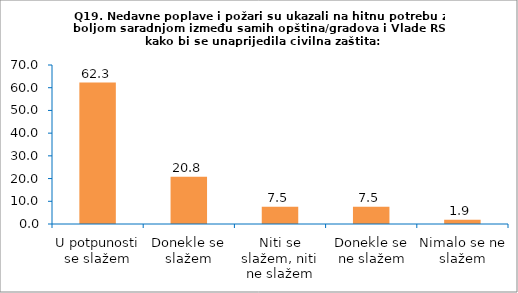
| Category | Series 0 |
|---|---|
| U potpunosti se slažem | 62.264 |
| Donekle se slažem | 20.755 |
| Niti se slažem, niti ne slažem | 7.547 |
| Donekle se ne slažem | 7.547 |
| Nimalo se ne slažem | 1.887 |